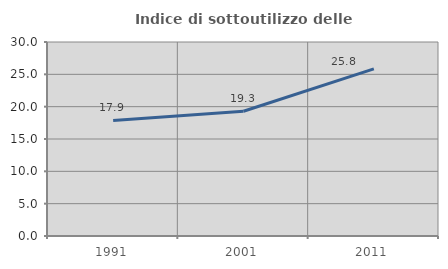
| Category | Indice di sottoutilizzo delle abitazioni  |
|---|---|
| 1991.0 | 17.864 |
| 2001.0 | 19.293 |
| 2011.0 | 25.838 |